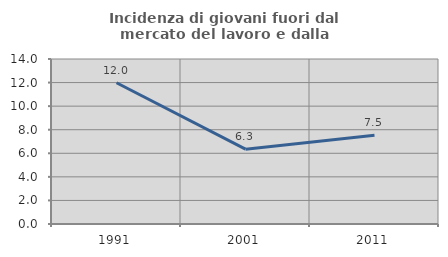
| Category | Incidenza di giovani fuori dal mercato del lavoro e dalla formazione  |
|---|---|
| 1991.0 | 11.983 |
| 2001.0 | 6.347 |
| 2011.0 | 7.539 |